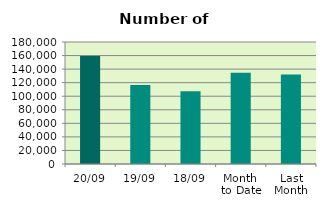
| Category | Series 0 |
|---|---|
| 20/09 | 159488 |
| 19/09 | 116644 |
| 18/09 | 107300 |
| Month 
to Date | 134768.533 |
| Last
Month | 132110.818 |